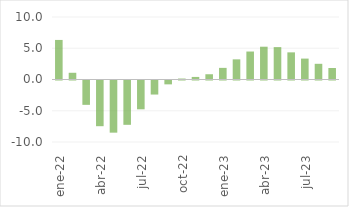
| Category | Total |
|---|---|
| ene-22 | 6.331 |
| feb-22 | 1.077 |
| mar-22 | -3.896 |
| abr-22 | -7.312 |
| may-22 | -8.348 |
| jun-22 | -7.091 |
| jul-22 | -4.611 |
| ago-22 | -2.248 |
| sep-22 | -0.618 |
| oct-22 | 0.155 |
| nov-22 | 0.413 |
| dic-22 | 0.842 |
| ene-23 | 1.862 |
| feb-23 | 3.223 |
| mar-23 | 4.477 |
| abr-23 | 5.248 |
| may-23 | 5.185 |
| jun-23 | 4.344 |
| jul-23 | 3.346 |
| ago-23 | 2.511 |
| sep-23 | 1.837 |